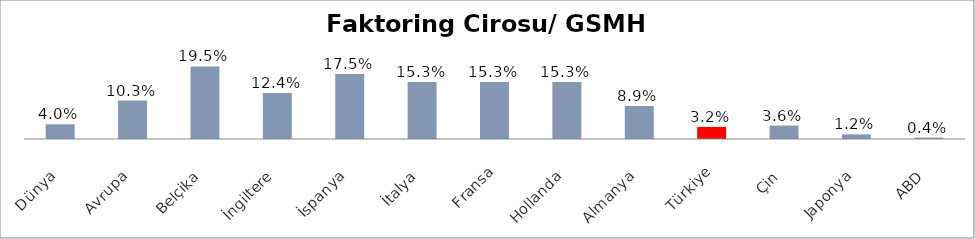
| Category | Faktoring Cirosu/ GSMH (%) |
|---|---|
| Dünya | 0.04 |
| Avrupa | 0.103 |
| Belçika | 0.195 |
| İngiltere | 0.124 |
| İspanya | 0.175 |
| İtalya | 0.153 |
| Fransa | 0.153 |
| Hollanda | 0.153 |
| Almanya | 0.089 |
| Türkiye | 0.032 |
| Çin | 0.036 |
| Japonya | 0.012 |
| ABD | 0.004 |